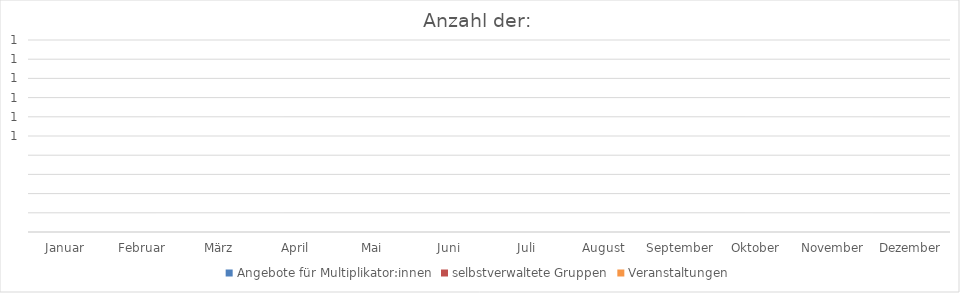
| Category | Angebote für Multiplikator:innen | selbstverwaltete Gruppen | Veranstaltungen |
|---|---|---|---|
| Januar | 0 | 0 | 0 |
| Februar | 0 | 0 | 0 |
| März | 0 | 0 | 0 |
| April | 0 | 0 | 0 |
| Mai | 0 | 0 | 0 |
| Juni | 0 | 0 | 0 |
| Juli | 0 | 0 | 0 |
| August | 0 | 0 | 0 |
| September | 0 | 0 | 0 |
| Oktober | 0 | 0 | 0 |
| November | 0 | 0 | 0 |
| Dezember | 0 | 0 | 0 |